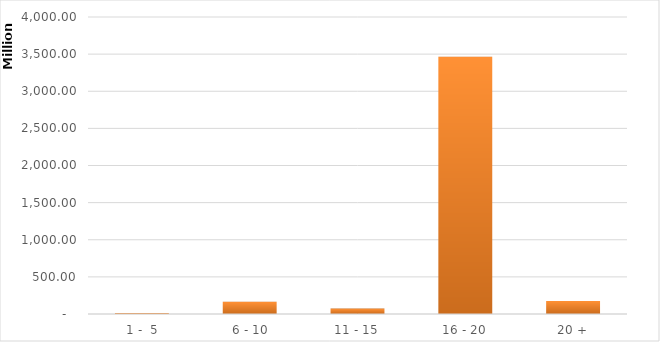
| Category | Maturity (years) |
|---|---|
|  1 -  5 | 14250911.73 |
|  6 - 10 | 163327490.59 |
| 11 - 15 | 72977914.5 |
| 16 - 20 | 3465776482.71 |
| 20 + | 176198816.49 |